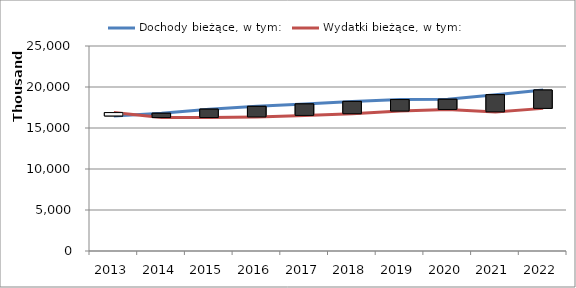
| Category | Dochody bieżące, w tym: | Wydatki bieżące, w tym: |
|---|---|---|
| 2013.0 | 16467129.5 | 16881117.5 |
| 2014.0 | 16800000 | 16272983 |
| 2015.0 | 17300000 | 16273673 |
| 2016.0 | 17643950 | 16346533 |
| 2017.0 | 17937269 | 16533929 |
| 2018.0 | 18245387 | 16741237 |
| 2019.0 | 18468748 | 17061844 |
| 2020.0 | 18507811 | 17260149 |
| 2021.0 | 19063045 | 16966564 |
| 2022.0 | 19634936 | 17393510 |